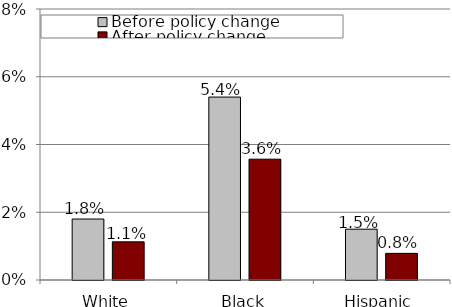
| Category | Before policy change | After policy change |
|---|---|---|
| White | 0.018 | 0.011 |
| Black | 0.054 | 0.036 |
| Hispanic | 0.015 | 0.008 |